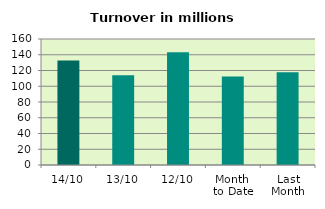
| Category | Series 0 |
|---|---|
| 14/10 | 132.651 |
| 13/10 | 113.935 |
| 12/10 | 143.04 |
| Month 
to Date | 112.38 |
| Last
Month | 117.918 |